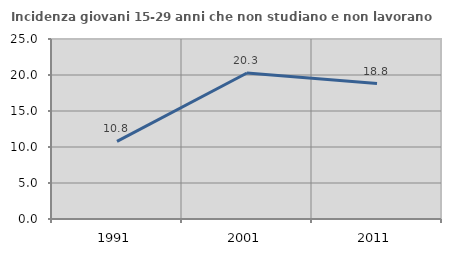
| Category | Incidenza giovani 15-29 anni che non studiano e non lavorano  |
|---|---|
| 1991.0 | 10.776 |
| 2001.0 | 20.282 |
| 2011.0 | 18.819 |